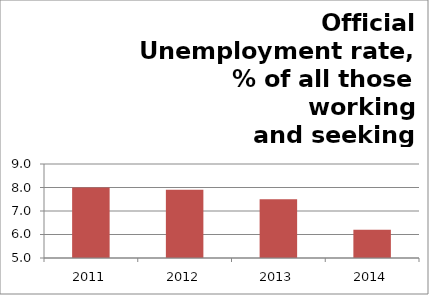
| Category | Series 1 |
|---|---|
| 2011.0 | 8 |
| 2012.0 | 7.9 |
| 2013.0 | 7.5 |
| 2014.0 | 6.2 |